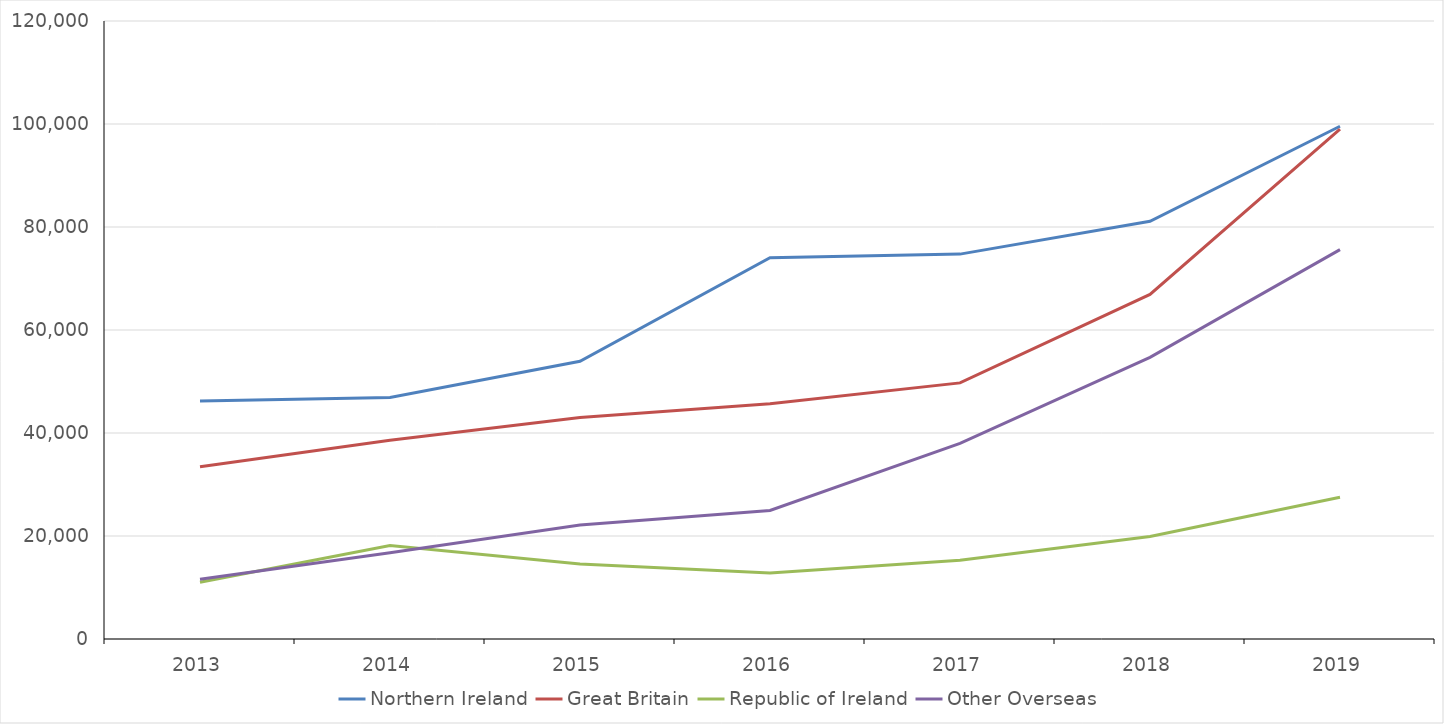
| Category | Northern Ireland | Great Britain | Republic of Ireland | Other Overseas  |
|---|---|---|---|---|
| 2013.0 | 46232.716 | 33459.617 | 11008.547 | 11592.669 |
| 2014.0 | 46899.135 | 38581.683 | 18157.992 | 16767.14 |
| 2015.0 | 53931.05 | 43028.66 | 14543.4 | 22155.12 |
| 2016.0 | 74027.73 | 45702.49 | 12832.02 | 24969.49 |
| 2017.0 | 74734.56 | 49729.79 | 15286.17 | 37985.58 |
| 2018.0 | 81119.79 | 66898.09 | 19907.88 | 54683.24 |
| 2019.0 | 99558.58 | 98995.89 | 27526.12 | 75598 |